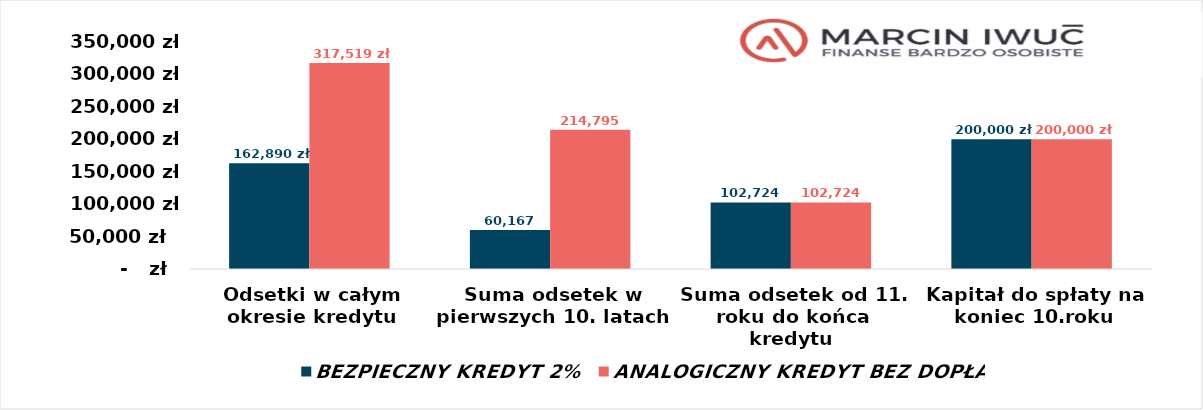
| Category | BEZPIECZNY KREDYT 2% | ANALOGICZNY KREDYT BEZ DOPŁAT |
|---|---|---|
| Odsetki w całym okresie kredytu | 162890.437 | 317518.77 |
| Suma odsetek w pierwszych 10. latach | 60166.667 | 214795 |
| Suma odsetek od 11. roku do końca kredytu | 102723.77 | 102723.77 |
| Kapitał do spłaty na koniec 10.roku | 200000 | 200000 |